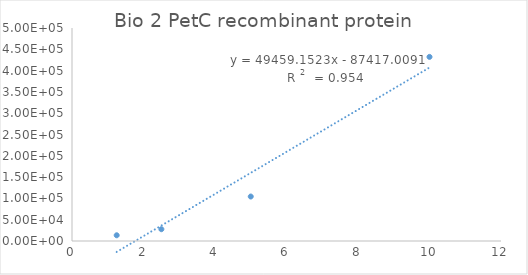
| Category | Series 0 |
|---|---|
| 10.0 | 432169.29 |
| 5.0 | 104405.46 |
| 2.5 | 27687.32 |
| 1.25 | 13429 |